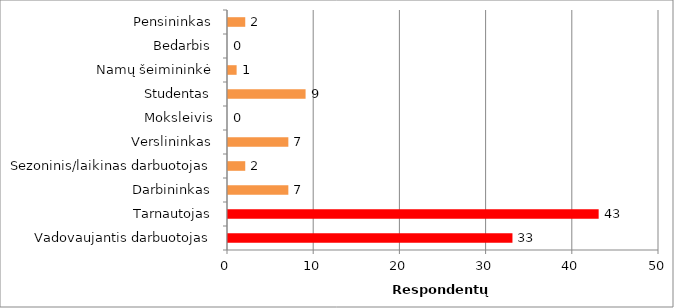
| Category | Series 0 |
|---|---|
| Vadovaujantis darbuotojas | 33 |
| Tarnautojas | 43 |
| Darbininkas | 7 |
| Sezoninis/laikinas darbuotojas | 2 |
| Verslininkas | 7 |
| Moksleivis | 0 |
| Studentas | 9 |
| Namų šeimininkė | 1 |
| Bedarbis | 0 |
| Pensininkas | 2 |